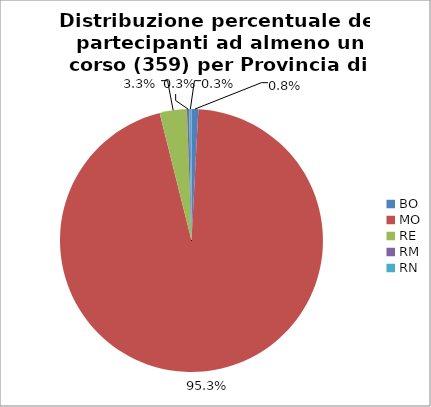
| Category | Nr. Tesserati |
|---|---|
| BO | 3 |
| MO | 342 |
| RE | 12 |
| RM | 1 |
| RN | 1 |